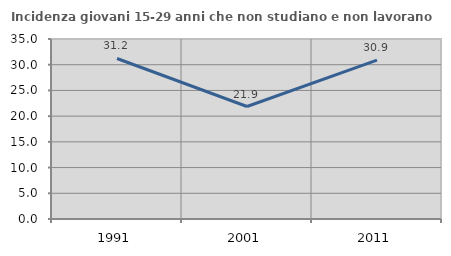
| Category | Incidenza giovani 15-29 anni che non studiano e non lavorano  |
|---|---|
| 1991.0 | 31.214 |
| 2001.0 | 21.875 |
| 2011.0 | 30.909 |